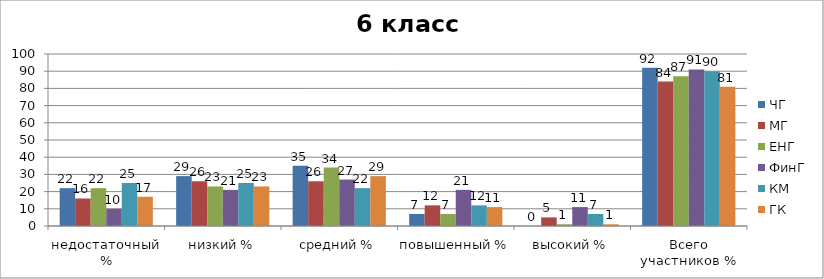
| Category | ЧГ | МГ | ЕНГ | ФинГ | КМ | ГК |
|---|---|---|---|---|---|---|
| недостаточный % | 22 | 16 | 22 | 10 | 25 | 17 |
| низкий % | 29 | 26 | 23 | 21 | 25 | 23 |
| средний % | 35 | 26 | 34 | 27 | 22 | 29 |
| повышенный % | 7 | 12 | 7 | 21 | 12 | 11 |
| высокий % | 0 | 5 | 1 | 11 | 7 | 1 |
| Всего участников % | 92 | 84 | 87 | 91 | 90 | 81 |